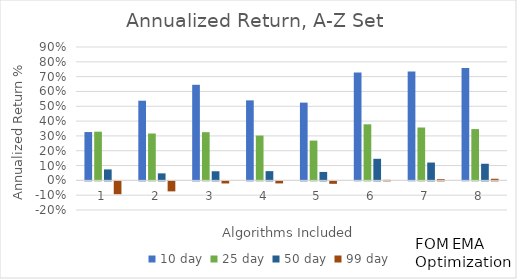
| Category | 10 day | 25 day | 50 day | 99 day |
|---|---|---|---|---|
| 1.0 | 0.326 | 0.328 | 0.074 | -0.087 |
| 2.0 | 0.538 | 0.316 | 0.047 | -0.068 |
| 3.0 | 0.645 | 0.325 | 0.061 | -0.014 |
| 4.0 | 0.54 | 0.302 | 0.062 | -0.014 |
| 5.0 | 0.525 | 0.268 | 0.057 | -0.017 |
| 6.0 | 0.728 | 0.378 | 0.146 | 0.003 |
| 7.0 | 0.734 | 0.357 | 0.12 | 0.008 |
| 8.0 | 0.759 | 0.346 | 0.112 | 0.011 |